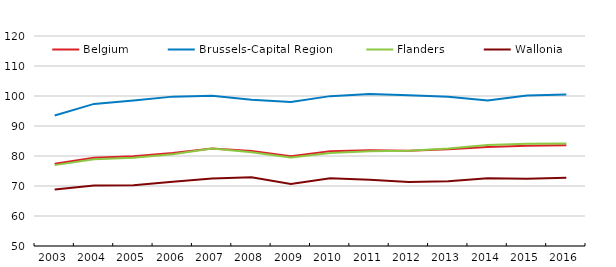
| Category | Belgium | Brussels-Capital Region | Flanders | Wallonia |
|---|---|---|---|---|
| 2003.0 | 77399.249 | 93491.225 | 76956.831 | 68820.283 |
| 2004.0 | 79430.233 | 97370.462 | 78907.941 | 70164.72 |
| 2005.0 | 79940.778 | 98463.359 | 79456.486 | 70279.519 |
| 2006.0 | 81037.696 | 99790.983 | 80573.787 | 71439.875 |
| 2007.0 | 82470.107 | 100090.786 | 82472.224 | 72463.776 |
| 2008.0 | 81641.178 | 98773.762 | 81214.617 | 72909.16 |
| 2009.0 | 79932.742 | 97981.468 | 79472.786 | 70688.42 |
| 2010.0 | 81603.227 | 99957.177 | 80998.187 | 72543.487 |
| 2011.0 | 81947.789 | 100705.37 | 81593.463 | 72089.126 |
| 2012.0 | 81785.032 | 100265.854 | 81771.409 | 71362.714 |
| 2013.0 | 82217.964 | 99772.985 | 82540.75 | 71554.716 |
| 2014.0 | 82967.325 | 98523.548 | 83639.657 | 72610.284 |
| 2015.0 | 83393.618 | 100174.171 | 84072.748 | 72441.709 |
| 2016.0 | 83568.193 | 100537.144 | 84162.745 | 72779.272 |